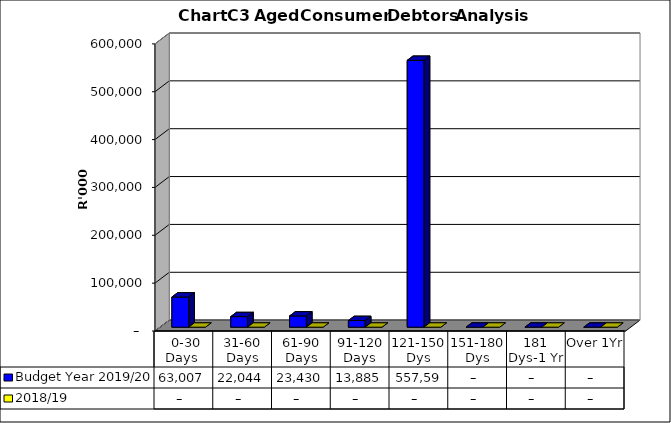
| Category | Budget Year 2019/20 | 2018/19 |
|---|---|---|
|  0-30 Days  | 63007254.58 | 0 |
| 31-60 Days | 22044302.58 | 0 |
| 61-90 Days | 23430435.81 | 0 |
| 91-120 Days | 13884810.21 | 0 |
| 121-150 Dys | 557594611.65 | 0 |
| 151-180 Dys | 0 | 0 |
| 181 Dys-1 Yr | 0 | 0 |
| Over 1Yr | 0 | 0 |